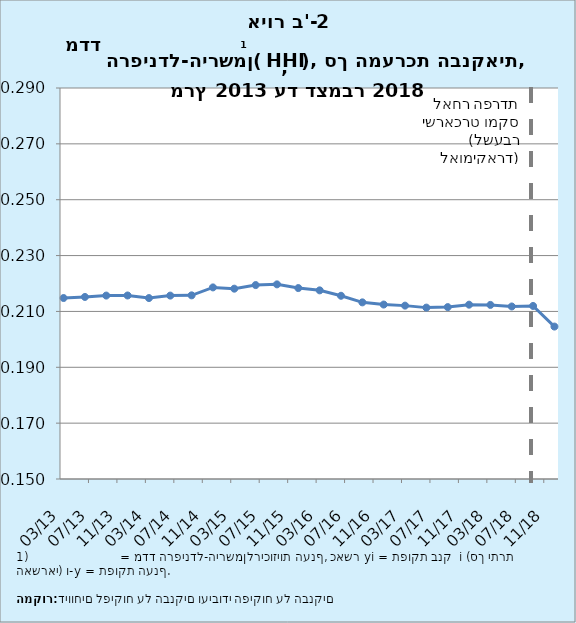
| Category | Series 0 |
|---|---|
| 2013-03-31 | 0.215 |
| 2013-06-30 | 0.215 |
| 2013-09-30 | 0.216 |
| 2013-12-31 | 0.216 |
| 2014-03-31 | 0.215 |
| 2014-06-30 | 0.216 |
| 2014-09-30 | 0.216 |
| 2014-12-31 | 0.219 |
| 2015-03-31 | 0.218 |
| 2015-06-30 | 0.219 |
| 2015-09-30 | 0.22 |
| 2015-12-31 | 0.218 |
| 2016-03-31 | 0.218 |
| 2016-06-30 | 0.216 |
| 2016-09-30 | 0.213 |
| 2016-12-31 | 0.212 |
| 2017-03-31 | 0.212 |
| 2017-06-30 | 0.211 |
| 2017-09-30 | 0.212 |
| 2017-12-31 | 0.212 |
| 2018-03-31 | 0.212 |
| 2018-06-30 | 0.212 |
| 2018-09-30 | 0.212 |
| 2018-12-31 | 0.205 |